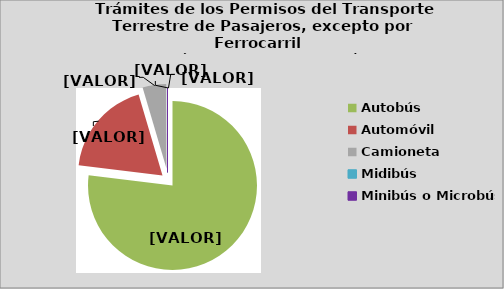
| Category | Series 0 |
|---|---|
| Autobús | 76.961 |
| Automóvil | 18.481 |
| Camioneta | 4.523 |
| Midibús | 0.03 |
| Minibús o Microbús | 0.012 |